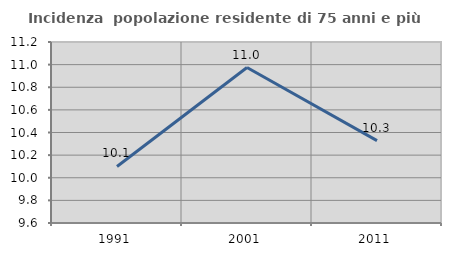
| Category | Incidenza  popolazione residente di 75 anni e più |
|---|---|
| 1991.0 | 10.1 |
| 2001.0 | 10.974 |
| 2011.0 | 10.329 |